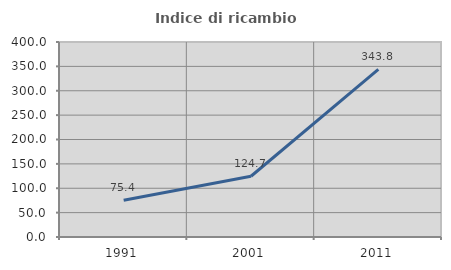
| Category | Indice di ricambio occupazionale  |
|---|---|
| 1991.0 | 75.446 |
| 2001.0 | 124.658 |
| 2011.0 | 343.75 |